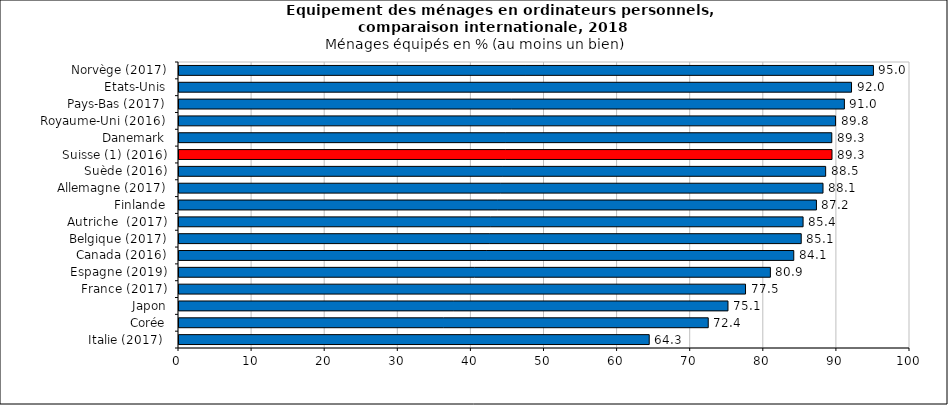
| Category | Italie (2017)  |
|---|---|
| Italie (2017)  | 64.326 |
| Corée | 72.4 |
| Japon | 75.1 |
| France (2017) | 77.5 |
| Espagne (2019) | 80.9 |
| Canada (2016) | 84.1 |
| Belgique (2017) | 85.119 |
| Autriche  (2017) | 85.373 |
| Finlande | 87.2 |
| Allemagne (2017) | 88.1 |
| Suède (2016) | 88.463 |
| Suisse (1) (2016) | 89.33 |
| Danemark | 89.3 |
| Royaume-Uni (2016) | 89.816 |
| Pays-Bas (2017) | 91.026 |
| Etats-Unis | 92 |
| Norvège (2017) | 95 |